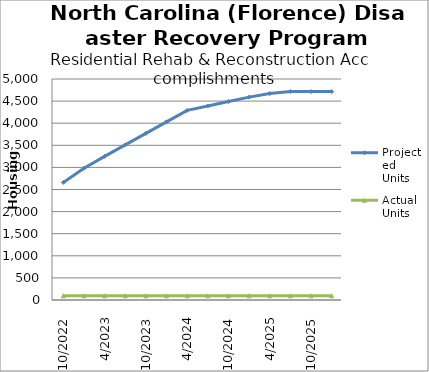
| Category | Projected Units | Actual Units |
|---|---|---|
| 10/2022 | 2660 | 95 |
| 1/2023 | 2980 | 95 |
| 4/2023 | 3250 | 95 |
| 7/2023 | 3510 | 95 |
| 10/2023 | 3770 | 95 |
| 1/2024 | 4030 | 95 |
| 4/2024 | 4290 | 95 |
| 7/2024 | 4390 | 95 |
| 10/2024 | 4490 | 95 |
| 1/2025 | 4590 | 95 |
| 4/2025 | 4670 | 95 |
| 7/2025 | 4715 | 95 |
| 10/2025 | 4715 | 95 |
| 1/2026 | 4715 | 95 |